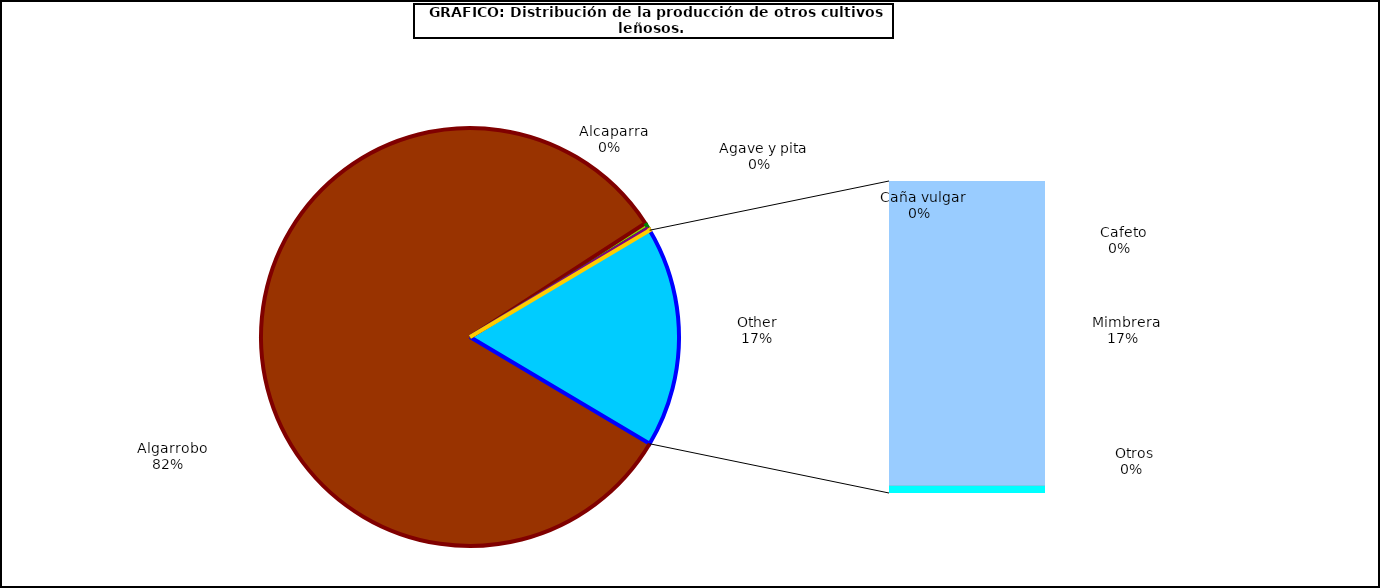
| Category | Series 0 |
|---|---|
|   Algarrobo | 60400 |
|   Alcaparra | 313 |
|   Agave y pita | 8 |
|   Caña vulgar | 138 |
|   Mimbrera | 12223 |
|   Cafeto | 12 |
|   Otros | 291 |